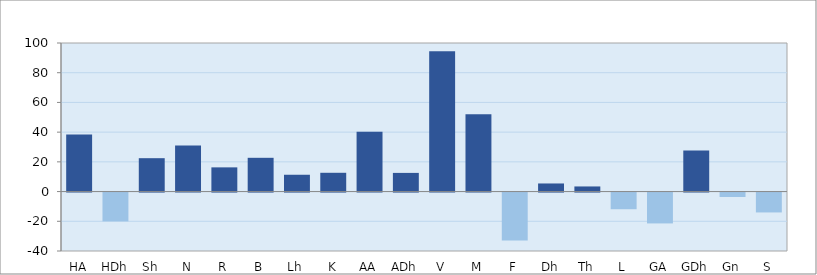
| Category | Series 0 |
|---|---|
| HA | 38.462 |
| HDh | -19.385 |
| Sh | 22.472 |
| N | 31.061 |
| R | 16.292 |
| B | 22.727 |
| Lh | 11.321 |
| K | 12.644 |
| AA | 40.244 |
| ADh | 12.568 |
| V | 94.444 |
| M | 52.083 |
| F | -32.222 |
| Dh | 5.455 |
| Th | 3.448 |
| L | -11.211 |
| GA | -20.765 |
| GDh | 27.66 |
| Gn | -2.976 |
| S | -13.38 |